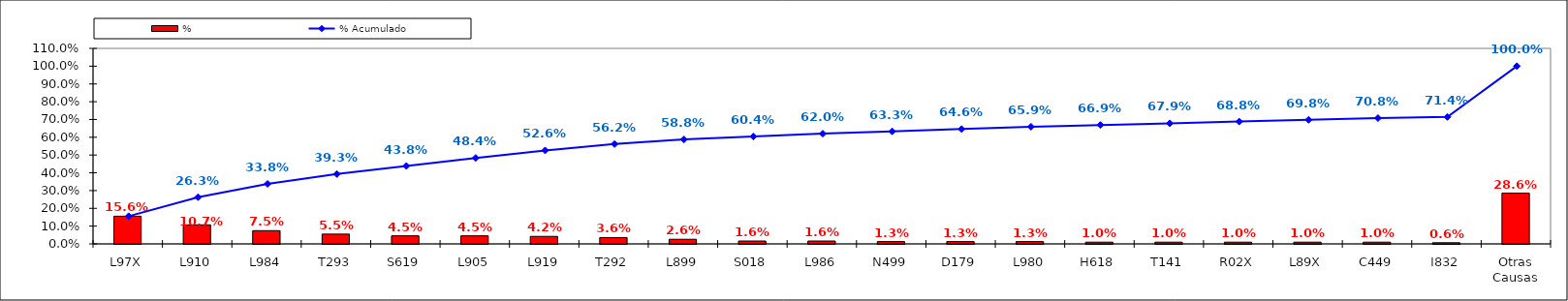
| Category | % |
|---|---|
| L97X | 0.156 |
| L910 | 0.107 |
| L984 | 0.075 |
| T293 | 0.055 |
| S619 | 0.045 |
| L905 | 0.045 |
| L919 | 0.042 |
| T292 | 0.036 |
| L899 | 0.026 |
| S018 | 0.016 |
| L986 | 0.016 |
| N499 | 0.013 |
| D179 | 0.013 |
| L980 | 0.013 |
| H618 | 0.01 |
| T141 | 0.01 |
| R02X | 0.01 |
| L89X | 0.01 |
| C449 | 0.01 |
| I832 | 0.006 |
| Otras Causas | 0.286 |